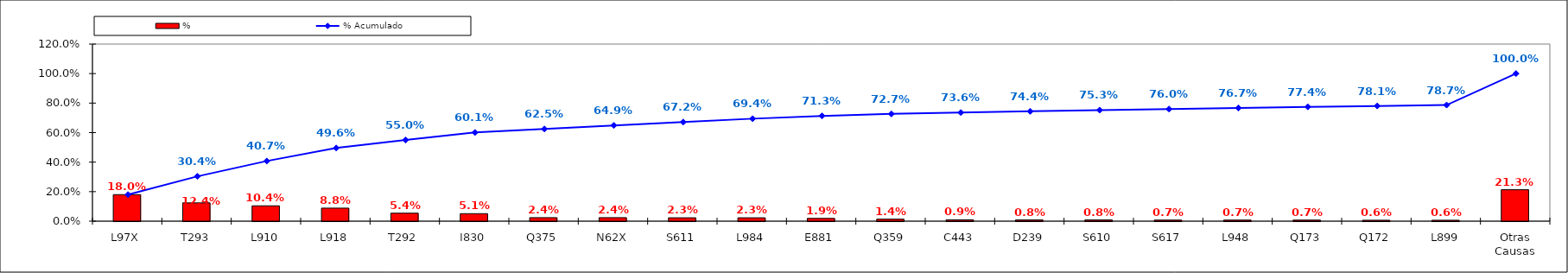
| Category | % |
|---|---|
| L97X | 0.18 |
| T293 | 0.124 |
| L910 | 0.104 |
| L918 | 0.088 |
| T292 | 0.054 |
| I830 | 0.051 |
| Q375 | 0.024 |
| N62X | 0.024 |
| S611 | 0.023 |
| L984 | 0.023 |
| E881 | 0.019 |
| Q359 | 0.014 |
| C443 | 0.009 |
| D239 | 0.008 |
| S610 | 0.008 |
| S617 | 0.007 |
| L948 | 0.007 |
| Q173 | 0.007 |
| Q172 | 0.006 |
| L899 | 0.006 |
| Otras Causas | 0.213 |